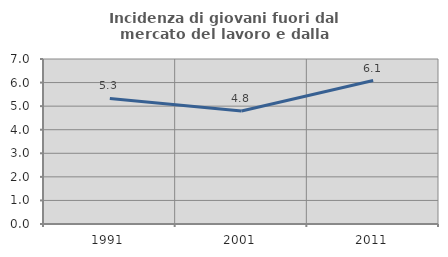
| Category | Incidenza di giovani fuori dal mercato del lavoro e dalla formazione  |
|---|---|
| 1991.0 | 5.325 |
| 2001.0 | 4.792 |
| 2011.0 | 6.084 |